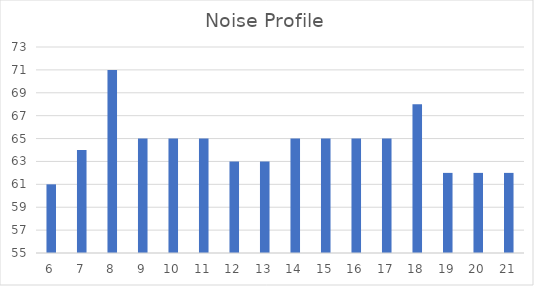
| Category | Series 0 |
|---|---|
| 6.0 | 61 |
| 7.0 | 64 |
| 8.0 | 71 |
| 9.0 | 65 |
| 10.0 | 65 |
| 11.0 | 65 |
| 12.0 | 63 |
| 13.0 | 63 |
| 14.0 | 65 |
| 15.0 | 65 |
| 16.0 | 65 |
| 17.0 | 65 |
| 18.0 | 68 |
| 19.0 | 62 |
| 20.0 | 62 |
| 21.0 | 62 |